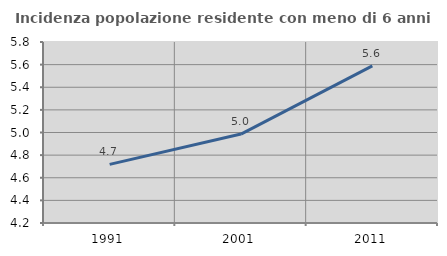
| Category | Incidenza popolazione residente con meno di 6 anni |
|---|---|
| 1991.0 | 4.718 |
| 2001.0 | 4.986 |
| 2011.0 | 5.59 |